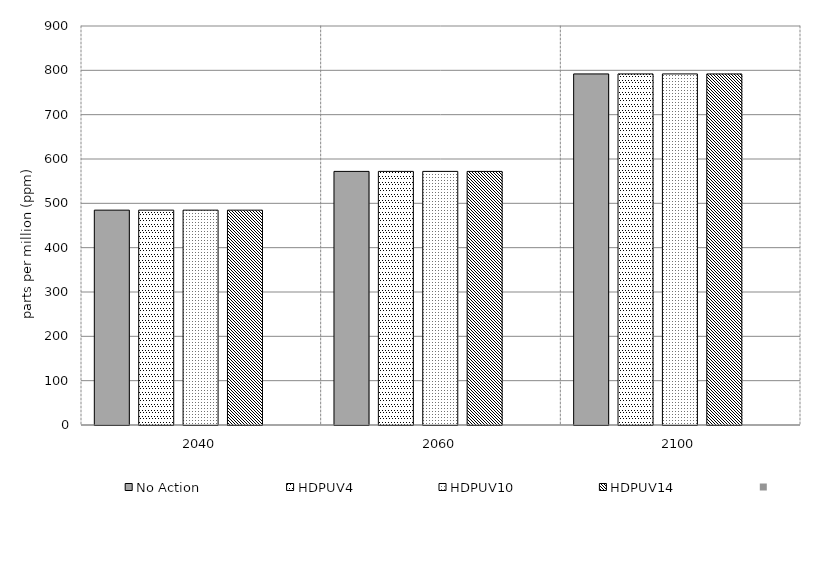
| Category | No Action | HDPUV4 | HDPUV10 | HDPUV14 | Series 4 | Alt 5 | Alt 6 | Alt 7 | Alt 8 | Alt 10 |
|---|---|---|---|---|---|---|---|---|---|---|
| 2040.0 | 484.639 | 484.639 | 484.638 | 484.636 |  |  |  |  |  |  |
| 2060.0 | 572.027 | 572.027 | 572.023 | 572.011 |  |  |  |  |  |  |
| 2100.0 | 791.896 | 791.896 | 791.886 | 791.857 |  |  |  |  |  |  |